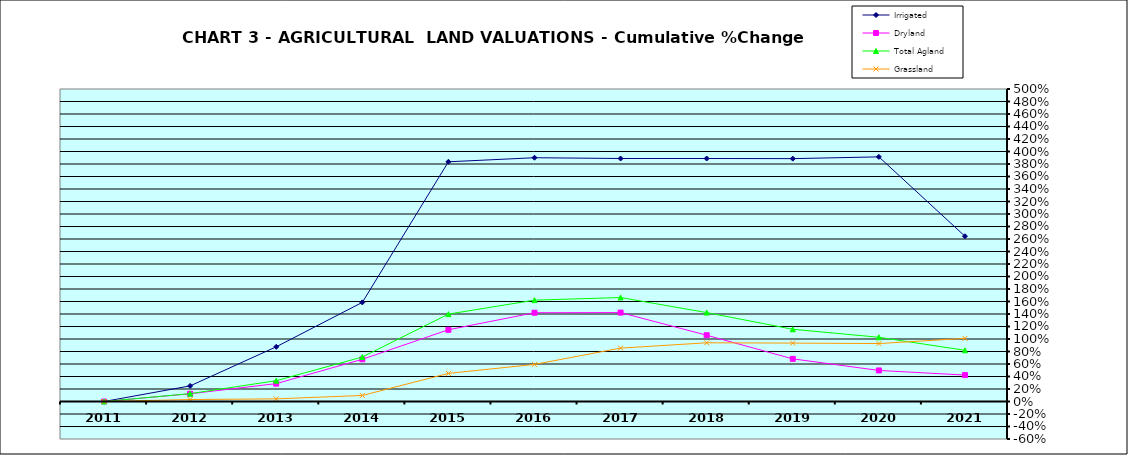
| Category | Irrigated | Dryland | Total Agland | Grassland |
|---|---|---|---|---|
| 2011.0 | 0 | 0 | 0 | 0 |
| 2012.0 | 0.25 | 0.124 | 0.126 | 0.032 |
| 2013.0 | 0.875 | 0.286 | 0.333 | 0.042 |
| 2014.0 | 1.586 | 0.675 | 0.712 | 0.097 |
| 2015.0 | 3.835 | 1.148 | 1.398 | 0.45 |
| 2016.0 | 3.9 | 1.421 | 1.622 | 0.593 |
| 2017.0 | 3.888 | 1.423 | 1.664 | 0.854 |
| 2018.0 | 3.888 | 1.06 | 1.422 | 0.939 |
| 2019.0 | 3.886 | 0.682 | 1.155 | 0.934 |
| 2020.0 | 3.914 | 0.497 | 1.028 | 0.927 |
| 2021.0 | 2.644 | 0.423 | 0.819 | 1.01 |